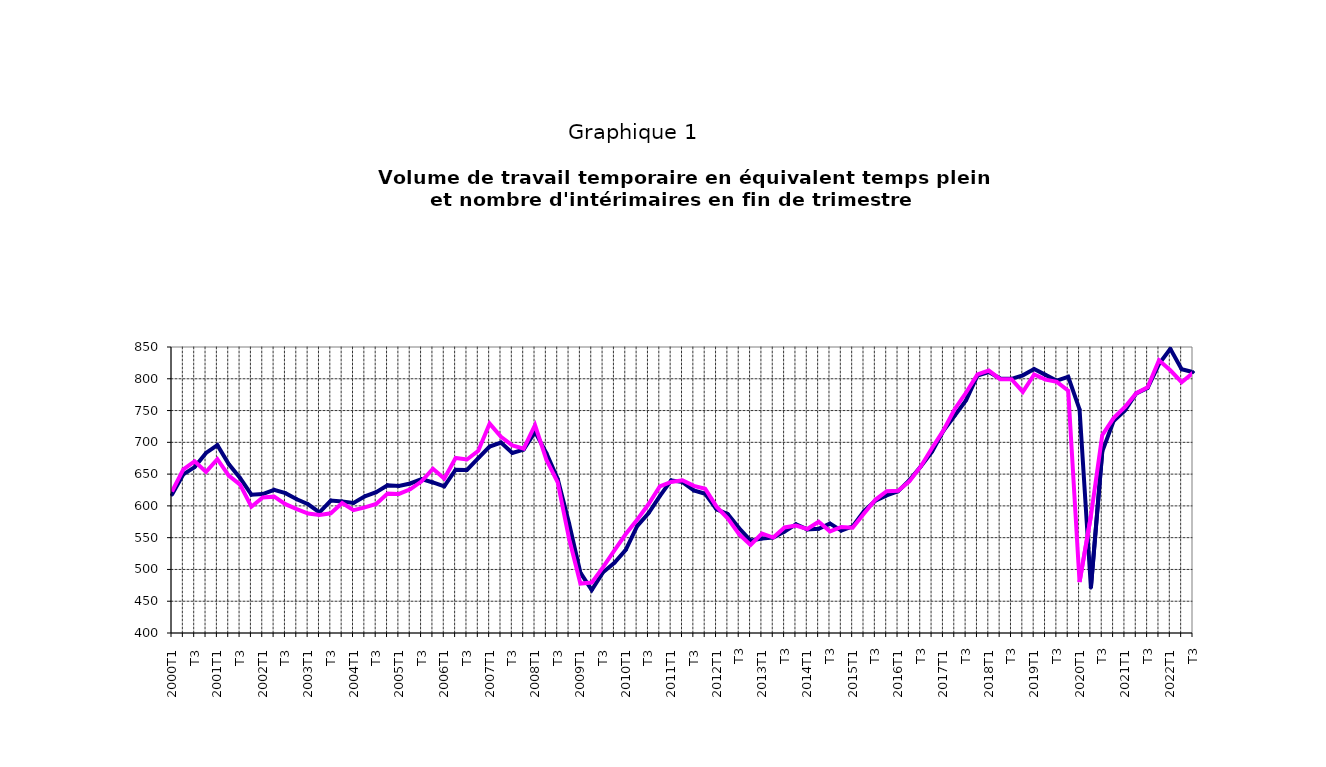
| Category | EETP | int |
|---|---|---|
| 2000T1 | 617.8 | 622.594 |
|      T2 | 649.633 | 657.411 |
|      T3 | 661.019 | 670.235 |
|      T4 | 683.341 | 653.452 |
| 2001T1 | 695.621 | 673.54 |
|      T2 | 665.84 | 647.568 |
|      T3 | 644.044 | 633.511 |
|      T4 | 617.544 | 598.655 |
| 2002T1 | 618.641 | 613.226 |
|      T2 | 625.36 | 614.538 |
|      T3 | 620.027 | 602.771 |
|      T4 | 610.383 | 594.948 |
| 2003T1 | 602.57 | 587.88 |
|      T2 | 589.781 | 585.855 |
|      T3 | 608.459 | 588.311 |
|      T4 | 606.866 | 604.404 |
| 2004T1 | 604.489 | 593.289 |
|      T2 | 615.125 | 597.707 |
|      T3 | 621.48 | 603.032 |
|      T4 | 632.581 | 619.458 |
| 2005T1 | 631.411 | 618.799 |
|      T2 | 635.258 | 626.101 |
|      T3 | 642.044 | 638.721 |
|      T4 | 636.863 | 658.508 |
| 2006T1 | 630.663 | 642.896 |
|      T2 | 656.874 | 675.389 |
|      T3 | 656.589 | 673.041 |
|      T4 | 675.156 | 686.787 |
| 2007T1 | 693.295 | 729.471 |
|      T2 | 699.715 | 708.656 |
|      T3 | 683.373 | 695.265 |
|      T4 | 688.64 | 690.036 |
| 2008T1 | 716.388 | 726.971 |
|      T2 | 682.979 | 672.678 |
|      T3 | 642.443 | 636.835 |
|      T4 | 572.845 | 548.528 |
| 2009T1 | 494.872 | 477.746 |
|      T2 | 467.694 | 479.358 |
|      T3 | 495.589 | 503.51 |
|      T4 | 510.36 | 529.933 |
| 2010T1 | 530.863 | 555.727 |
|      T2 | 568 | 578.292 |
|      T3 | 588.321 | 602.514 |
|      T4 | 615.309 | 630.78 |
| 2011T1 | 640.193 | 637.612 |
|      T2 | 637.435 | 640.323 |
|      T3 | 624.301 | 631.495 |
|      T4 | 619.079 | 626.897 |
| 2012T1 | 594.654 | 598.782 |
|      T2 | 587.118 | 579.97 |
| T3 | 564.855 | 554.974 |
| T4 | 545.274 | 538.465 |
| 2013T1 | 548.774 | 556.391 |
| T2 | 550.047 | 550.125 |
| T3 | 559.54 | 566.105 |
| T4 | 571.136 | 569.033 |
| 2014T1 | 562.958 | 563.601 |
| T2 | 563.906 | 574.982 |
| T3 | 572.094 | 559.889 |
| T4 | 561.148 | 566.852 |
| 2015T1 | 567.734 | 565.55 |
| T2 | 591.761 | 587.99 |
| T3 | 608.103 | 609.555 |
| T4 | 616.553 | 623.19 |
| 2016T1 | 622.932 | 623.7 |
| T2 | 640.299 | 638.552 |
| T3 | 661.769 | 662.027 |
| T4 | 685.405 | 691.018 |
| 2017T1 | 718.045 | 718.828 |
| T2 | 742.045 | 752.427 |
| T3 | 766.377 | 778.367 |
| T4 | 804.875 | 806.862 |
| 2018T1 | 810.641 | 812.937 |
| T2 | 800.525 | 799.365 |
| T3 | 799.881 | 799.307 |
| T4 | 805.458 | 779.394 |
| 2019T1 | 815.295 | 806.729 |
| T2 | 806.183 | 798.66 |
| T3 | 796.993 | 795.178 |
| T4 | 803.121 | 781.2 |
| 2020T1 | 751.736 | 480.214 |
| T2 | 471.442 | 584.072 |
| T3 | 685.327 | 711.218 |
| T4 | 733.655 | 738.24 |
| 2021T1 | 750.278 | 755.53 |
| T2 | 777.045 | 777.317 |
| T3 | 785.515 | 786.701 |
| T4 | 823.126 | 829.184 |
| 2022T1 | 847.133 | 813.317 |
| T2 | 814.91 | 794.662 |
| T3 | 810.408 | 809.58 |